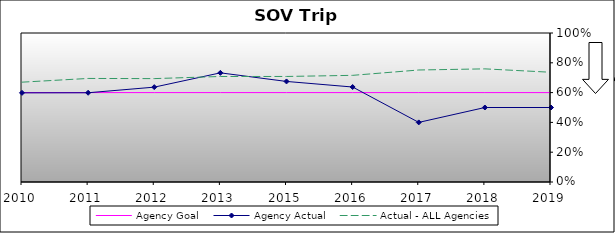
| Category | Agency Goal | Agency Actual | Actual - ALL Agencies |
|---|---|---|---|
| 2010.0 | 0.6 | 0.598 | 0.67 |
| 2011.0 | 0.6 | 0.599 | 0.695 |
| 2012.0 | 0.6 | 0.637 | 0.694 |
| 2013.0 | 0.6 | 0.732 | 0.708 |
| 2015.0 | 0.6 | 0.675 | 0.708 |
| 2016.0 | 0.6 | 0.637 | 0.716 |
| 2017.0 | 0.6 | 0.4 | 0.752 |
| 2018.0 | 0.6 | 0.5 | 0.759 |
| 2019.0 | 0.6 | 0.5 | 0.736 |